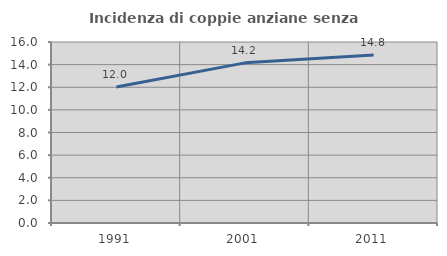
| Category | Incidenza di coppie anziane senza figli  |
|---|---|
| 1991.0 | 12.019 |
| 2001.0 | 14.156 |
| 2011.0 | 14.85 |